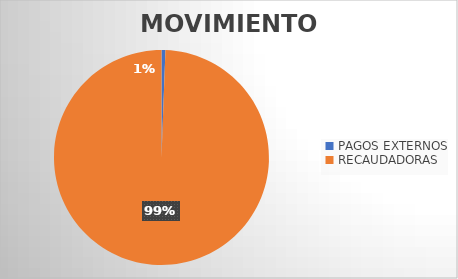
| Category | MOVIMIENTOS |
|---|---|
| PAGOS EXTERNOS | 133 |
| RECAUDADORAS | 22512 |